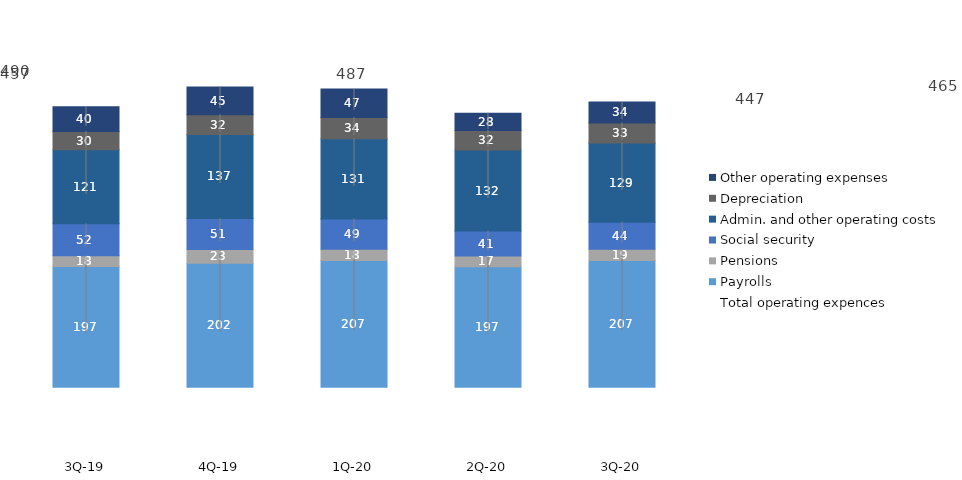
| Category | Payrolls | Pensions | Social security | Admin. and other operating costs | Depreciation | Other operating expenses |
|---|---|---|---|---|---|---|
| 3Q-20 | 206.727 | 18.585 | 43.952 | 129.288 | 32.697 | 34.057 |
| 2Q-20 | 196.66 | 17.386 | 40.656 | 132.408 | 31.771 | 27.996 |
| 1Q-20 | 206.729 | 18.337 | 49.424 | 130.978 | 34.5 | 46.562 |
| 4Q-19 | 202.122 | 22.717 | 50.527 | 137.063 | 32.223 | 45.052 |
| 3Q-19 | 197.115 | 17.531 | 51.896 | 120.883 | 29.827 | 40.201 |